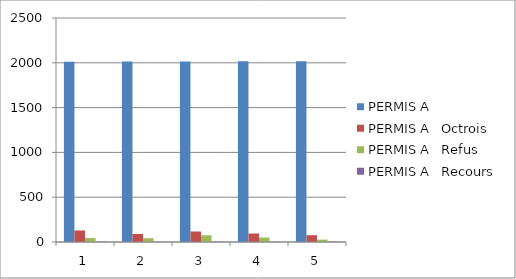
| Category | PERMIS A | PERMIS A Octrois | PERMIS A Refus | PERMIS A Recours |
|---|---|---|---|---|
| 0 | 2013 | 129 | 44 | 4 |
| 1 | 2014 | 89 | 42 | 2 |
| 2 | 2015 | 117 | 75 | 4 |
| 3 | 2016 | 95 | 50 | 2 |
| 4 | 2017 | 76 | 26 | 3 |